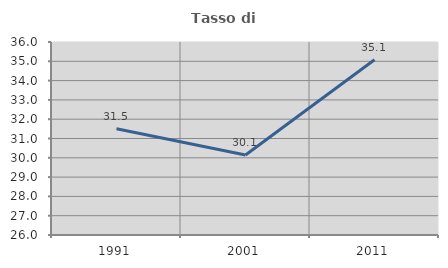
| Category | Tasso di occupazione   |
|---|---|
| 1991.0 | 31.501 |
| 2001.0 | 30.148 |
| 2011.0 | 35.079 |